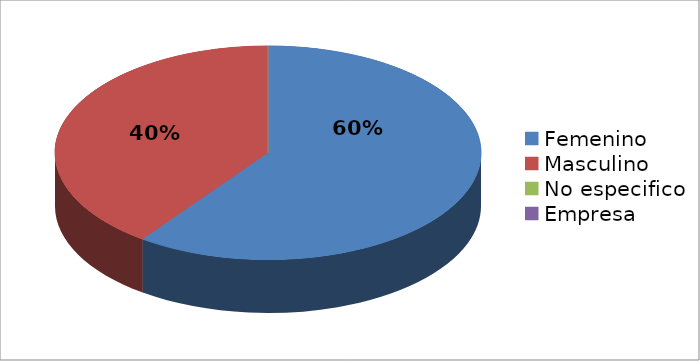
| Category | Series 0 |
|---|---|
| Femenino | 3 |
| Masculino | 2 |
| No especifico | 0 |
| Empresa | 0 |